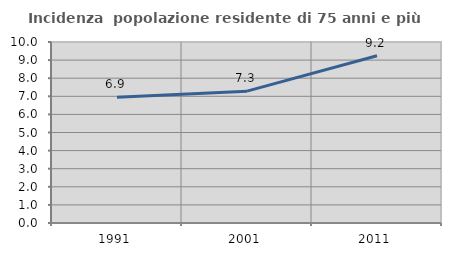
| Category | Incidenza  popolazione residente di 75 anni e più |
|---|---|
| 1991.0 | 6.944 |
| 2001.0 | 7.285 |
| 2011.0 | 9.236 |